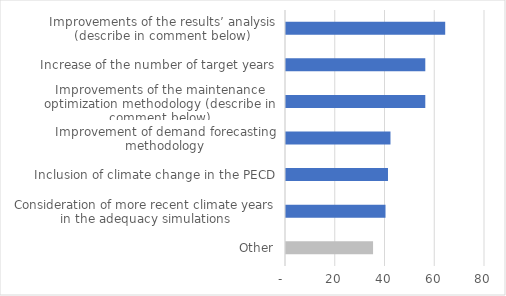
| Category | Priority score (highest = high priority) |
|---|---|
| Other | 35 |
| Consideration of more recent climate years in the adequacy simulations | 40 |
| Inclusion of climate change in the PECD | 41 |
| Improvement of demand forecasting methodology | 42 |
| Improvements of the maintenance optimization methodology (describe in comment below) | 56 |
| Increase of the number of target years | 56 |
| Improvements of the results’ analysis (describe in comment below) | 64 |